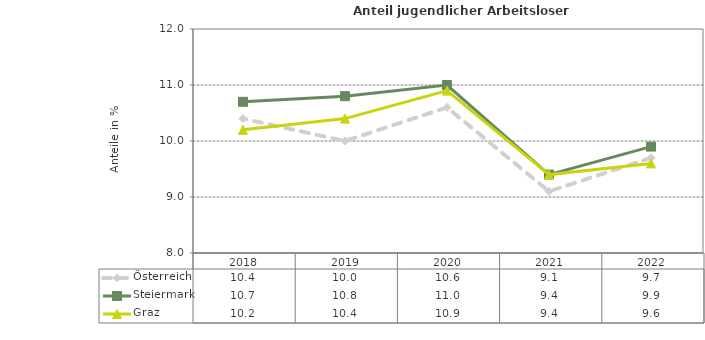
| Category | Österreich | Steiermark | Graz |
|---|---|---|---|
| 2022.0 | 9.7 | 9.9 | 9.6 |
| 2021.0 | 9.1 | 9.4 | 9.4 |
| 2020.0 | 10.6 | 11 | 10.9 |
| 2019.0 | 10 | 10.8 | 10.4 |
| 2018.0 | 10.4 | 10.7 | 10.2 |